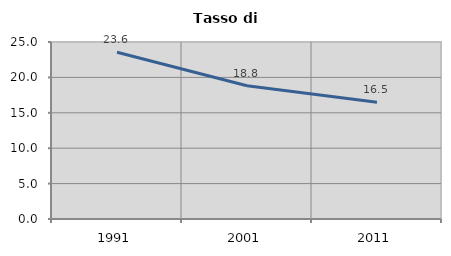
| Category | Tasso di disoccupazione   |
|---|---|
| 1991.0 | 23.558 |
| 2001.0 | 18.825 |
| 2011.0 | 16.494 |